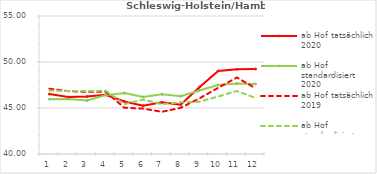
| Category | ab Hof tatsächlich 2020 | ab Hof standardisiert 2020 | ab Hof tatsächlich 2019 | ab Hof standardisiert 2019 |
|---|---|---|---|---|
| 0 | 46.514 | 45.958 | 47.105 | 46.899 |
| 1 | 46.185 | 45.974 | 46.832 | 46.847 |
| 2 | 46.237 | 45.807 | 46.754 | 46.835 |
| 3 | 46.429 | 46.399 | 46.779 | 46.874 |
| 4 | 45.714 | 46.617 | 45.028 | 45.411 |
| 5 | 45.244 | 46.196 | 44.935 | 45.919 |
| 6 | 45.614 | 46.497 | 44.585 | 45.419 |
| 7 | 45.363 | 46.282 | 45.021 | 45.614 |
| 8 | 47.257 | 46.909 | 46.04 | 45.686 |
| 9 | 49.03 | 47.495 | 47.188 | 46.248 |
| 10 | 49.205 | 47.658 | 48.318 | 46.846 |
| 11 | 49.239 | 47.603 | 47.138 | 46.096 |